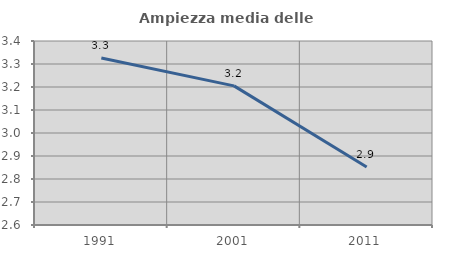
| Category | Ampiezza media delle famiglie |
|---|---|
| 1991.0 | 3.326 |
| 2001.0 | 3.205 |
| 2011.0 | 2.852 |